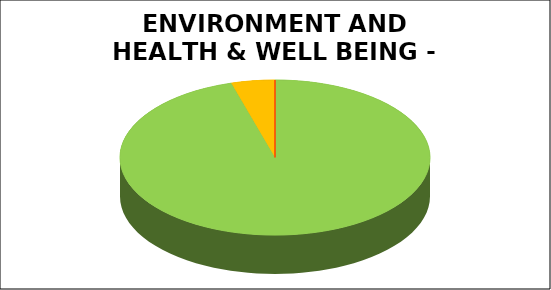
| Category | Series 0 |
|---|---|
| Green | 0.955 |
| Amber | 0.045 |
| Red | 0 |